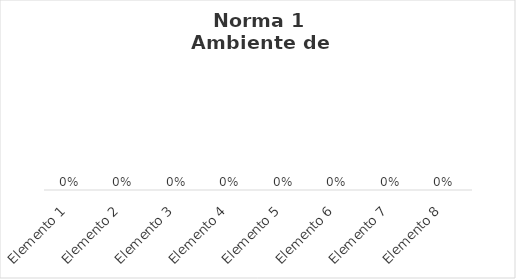
| Category | Series 0 |
|---|---|
| Elemento 1 | 0 |
| Elemento 2 | 0 |
| Elemento 3 | 0 |
| Elemento 4 | 0 |
| Elemento 5 | 0 |
| Elemento 6 | 0 |
| Elemento 7 | 0 |
| Elemento 8 | 0 |